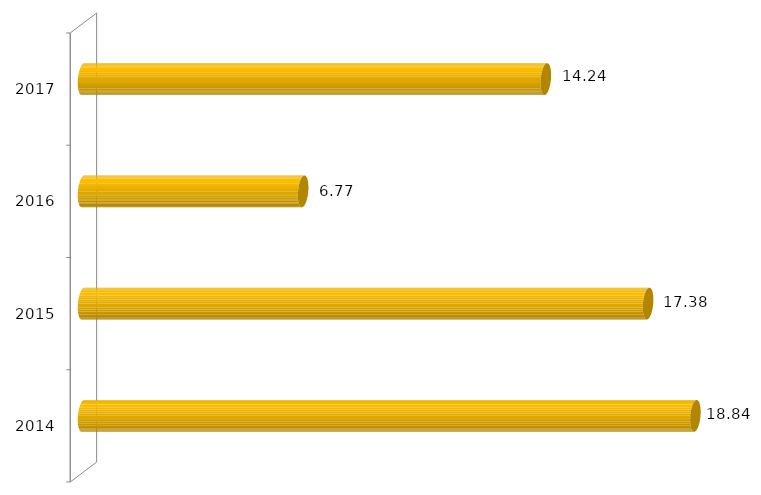
| Category | Relaçãocandidato x vaga sisu |
|---|---|
| 2014.0 | 18.84 |
| 2015.0 | 17.385 |
| 2016.0 | 6.773 |
| 2017.0 | 14.238 |